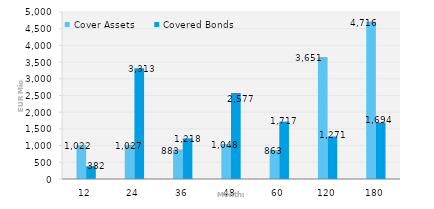
| Category | Cover Assets | Covered Bonds |
|---|---|---|
| 12.0 | 1021.924 | 382.487 |
| 24.0 | 1026.816 | 3313 |
| 36.0 | 883.129 | 1217.522 |
| 48.0 | 1048.434 | 2577.031 |
| 60.0 | 863.39 | 1717.318 |
| 120.0 | 3650.897 | 1271.445 |
| 180.0 | 4715.756 | 1694.093 |